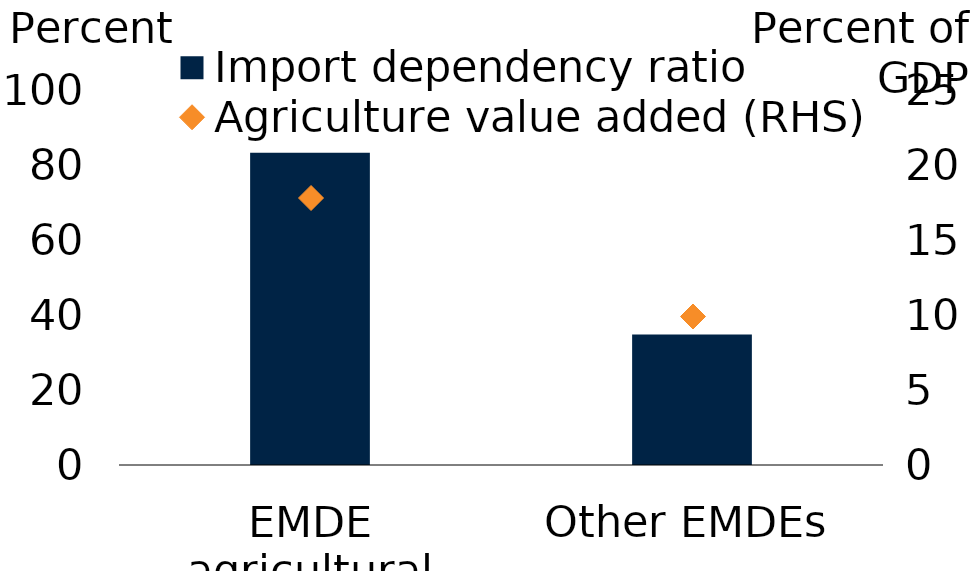
| Category | Import dependency ratio |
|---|---|
| EMDE agricultural exporters | 83.3 |
| Other EMDEs | 34.8 |